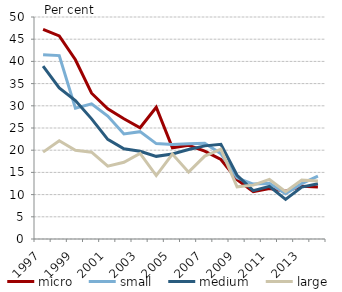
| Category | micro | small | medium | large |
|---|---|---|---|---|
| 1997.0 | 47.199 | 41.504 | 38.915 | 19.565 |
| 1998.0 | 45.755 | 41.312 | 34.03 | 22.117 |
| 1999.0 | 40.365 | 29.45 | 31.173 | 20 |
| 2000.0 | 32.831 | 30.451 | 27.062 | 19.561 |
| 2001.0 | 29.33 | 27.695 | 22.437 | 16.393 |
| 2002.0 | 27.093 | 23.656 | 20.334 | 17.287 |
| 2003.0 | 25.061 | 24.179 | 19.751 | 19.275 |
| 2004.0 | 29.668 | 21.484 | 18.613 | 14.295 |
| 2005.0 | 20.557 | 21.304 | 19.137 | 19.139 |
| 2006.0 | 21.115 | 21.444 | 20.14 | 15.062 |
| 2007.0 | 19.799 | 21.573 | 20.976 | 18.675 |
| 2008.0 | 17.896 | 19.209 | 21.331 | 20.221 |
| 2009.0 | 13.351 | 13.784 | 14.347 | 11.75 |
| 2010.0 | 10.655 | 12.374 | 10.878 | 12.132 |
| 2011.0 | 11.363 | 12.526 | 11.855 | 13.415 |
| 2012.0 | 10.745 | 10.173 | 8.933 | 10.667 |
| 2013.0 | 11.888 | 12.457 | 11.7 | 13.269 |
| 2014.0 | 11.734 | 14.144 | 12.44 | 13.084 |